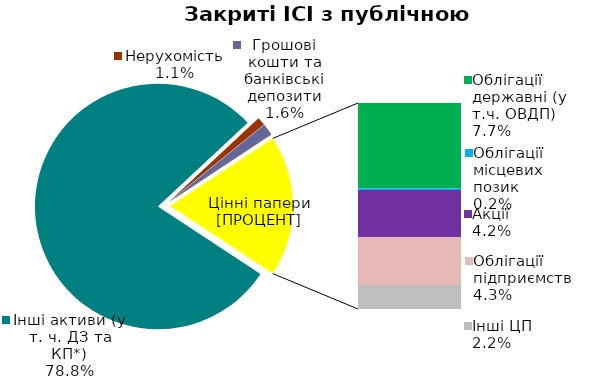
| Category | Series 0 |
|---|---|
| Інші активи (у т. ч. ДЗ та КП*) | 0.788 |
| Нерухомість | 0.011 |
| Грошові кошти та банківські депозити | 0.016 |
| Банківські метали | 0 |
| Облігації державні (у т.ч. ОВДП) | 0.077 |
| Облігації місцевих позик | 0.002 |
| Акції | 0.042 |
| Облігації підприємств | 0.043 |
| Векселі | 0 |
| Інші ЦП | 0.022 |